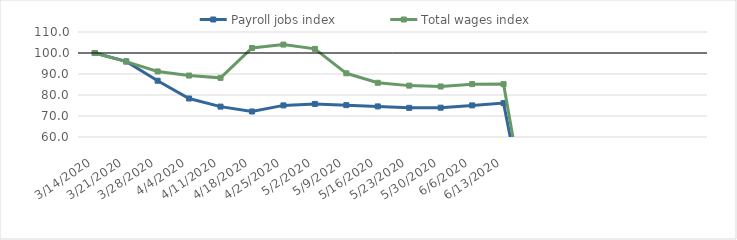
| Category | Payroll jobs index | Total wages index |
|---|---|---|
| 14/03/2020 | 100 | 100 |
| 21/03/2020 | 96.003 | 95.914 |
| 28/03/2020 | 86.8 | 91.22 |
| 04/04/2020 | 78.334 | 89.269 |
| 11/04/2020 | 74.467 | 88.174 |
| 18/04/2020 | 72.156 | 102.371 |
| 25/04/2020 | 75.056 | 104.011 |
| 02/05/2020 | 75.751 | 101.963 |
| 09/05/2020 | 75.17 | 90.328 |
| 16/05/2020 | 74.574 | 85.812 |
| 23/05/2020 | 73.889 | 84.466 |
| 30/05/2020 | 73.965 | 84.052 |
| 06/06/2020 | 75.054 | 85.174 |
| 13/06/2020 | 76.14 | 85.179 |